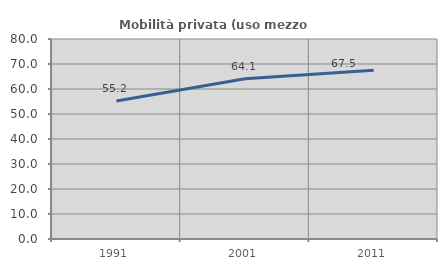
| Category | Mobilità privata (uso mezzo privato) |
|---|---|
| 1991.0 | 55.197 |
| 2001.0 | 64.109 |
| 2011.0 | 67.476 |